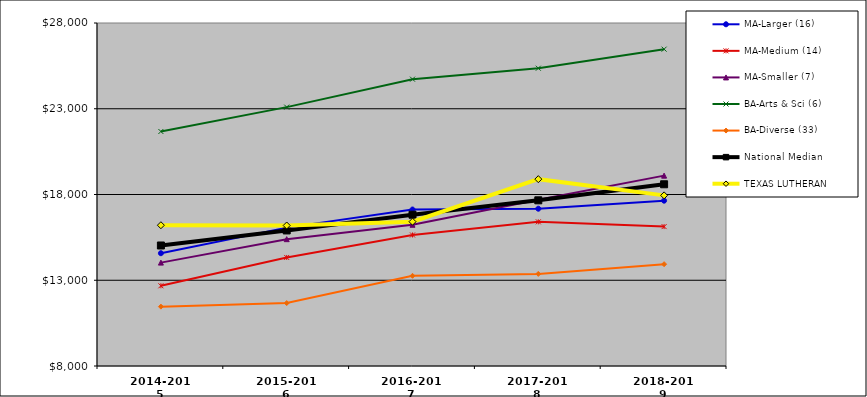
| Category | MA-Larger (16) | MA-Medium (14) | MA-Smaller (7) | BA-Arts & Sci (6) | BA-Diverse (33) | National Median | TEXAS LUTHERAN |
|---|---|---|---|---|---|---|---|
| 2014-2015 | 14577 | 12677 | 14028 | 21674 | 11462 | 15026.5 | 16208 |
| 2015-2016 | 16069 | 14328.5 | 15396 | 23095.5 | 11669 | 15904.5 | 16193 |
| 2016-2017 | 17123.5 | 15640 | 16235 | 24725.5 | 13259 | 16820.5 | 16415 |
| 2017-2018 | 17171.5 | 16406.5 | 17695 | 25363.5 | 13370 | 17661 | 18895 |
| 2018-2019 | 17639.5 | 16127 | 19100 | 26474.5 | 13937 | 18596 | 17949 |